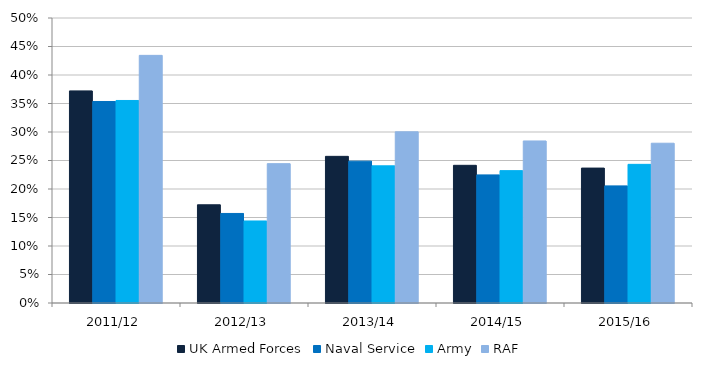
| Category | UK Armed Forces | Naval Service | Army | RAF |
|---|---|---|---|---|
| 2011/12 | 0.372 | 0.354 | 0.355 | 0.434 |
| 2012/13 | 0.172 | 0.157 | 0.144 | 0.244 |
| 2013/14 | 0.257 | 0.249 | 0.241 | 0.3 |
| 2014/15 | 0.242 | 0.225 | 0.232 | 0.284 |
| 2015/16 | 0.237 | 0.205 | 0.243 | 0.28 |